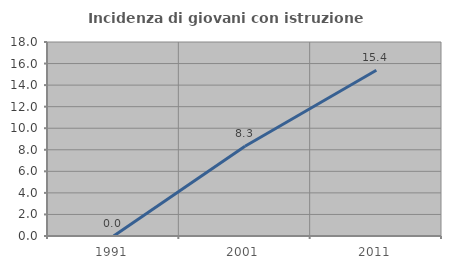
| Category | Incidenza di giovani con istruzione universitaria |
|---|---|
| 1991.0 | 0 |
| 2001.0 | 8.333 |
| 2011.0 | 15.385 |